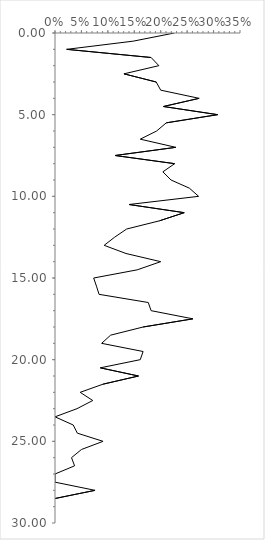
| Category | Series 0 |
|---|---|
| 0.22580645161290322 | 0 |
| 0.14788732394366197 | 0.5 |
| 0.022058823529411766 | 1 |
| 0.18181818181818182 | 1.5 |
| 0.19653179190751446 | 2 |
| 0.13043478260869565 | 2.5 |
| 0.19148936170212766 | 3 |
| 0.2 | 3.5 |
| 0.2727272727272727 | 4 |
| 0.20512820512820512 | 4.5 |
| 0.3076923076923077 | 5 |
| 0.21052631578947367 | 5.5 |
| 0.19230769230769232 | 6 |
| 0.16129032258064516 | 6.5 |
| 0.22857142857142856 | 7 |
| 0.11363636363636363 | 7.5 |
| 0.22641509433962265 | 8 |
| 0.20408163265306123 | 8.5 |
| 0.21951219512195122 | 9 |
| 0.2542372881355932 | 9.5 |
| 0.2717391304347826 | 10 |
| 0.14 | 10.5 |
| 0.24444444444444444 | 11 |
| 0.19753086419753085 | 11.5 |
| 0.13559322033898305 | 12 |
| 0.11290322580645161 | 12.5 |
| 0.09302325581395349 | 13 |
| 0.13432835820895522 | 13.5 |
| 0.2 | 14 |
| 0.15555555555555556 | 14.5 |
| 0.07317073170731707 | 15 |
| 0.0784313725490196 | 15.5 |
| 0.08333333333333333 | 16 |
| 0.17647058823529413 | 16.5 |
| 0.18181818181818182 | 17 |
| 0.2608695652173913 | 17.5 |
| 0.16666666666666666 | 18 |
| 0.10526315789473684 | 18.5 |
| 0.08823529411764706 | 19 |
| 0.16666666666666666 | 19.5 |
| 0.16129032258064516 | 20 |
| 0.08571428571428572 | 20.5 |
| 0.15789473684210525 | 21 |
| 0.09090909090909091 | 21.5 |
| 0.047619047619047616 | 22 |
| 0.07142857142857142 | 22.5 |
| 0.041666666666666664 | 23 |
| 0.0 | 23.5 |
| 0.034482758620689655 | 24 |
| 0.04225352112676056 | 24.5 |
| 0.09090909090909091 | 25 |
| 0.05 | 25.5 |
| 0.03125 | 26 |
| 0.037037037037037035 | 26.5 |
| 0.0 | 27 |
| 0.0 | 27.5 |
| 0.07575757575757576 | 28 |
| 0.0 | 28.5 |